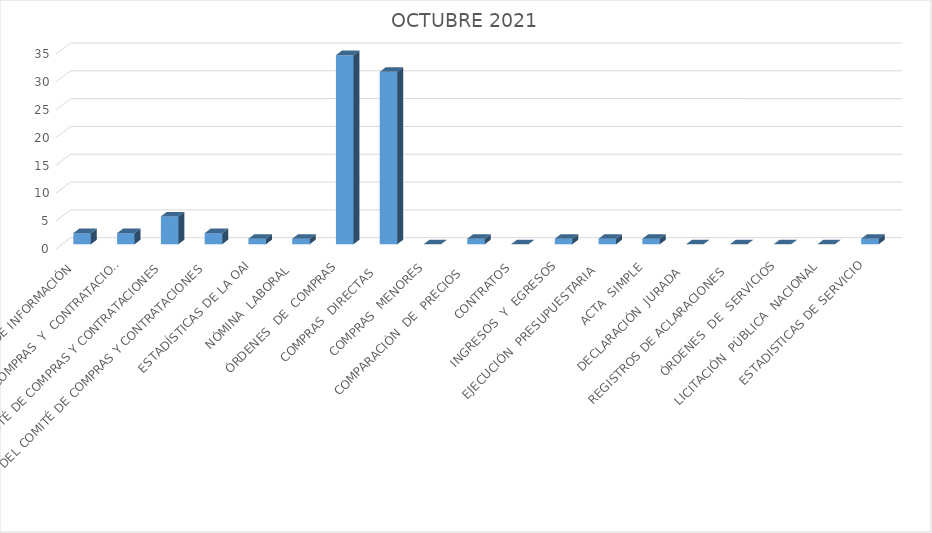
| Category | Series 0 |
|---|---|
| SOLICITUDES DE INFORMACIÓN  | 2 |
| REUNIONES DEL COMITÉ DE COMPRAS  Y  CONTRATACIONES | 2 |
| AGENDAS DEL COMITÉ DE COMPRAS Y CONTRATACIONES | 5 |
| ACTAS DEL COMITÉ DE COMPRAS Y CONTRATACIONES | 2 |
| ESTADÍSTICAS DE LA OAI | 1 |
| NÓMINA  LABORAL  | 1 |
| ÓRDENES  DE  COMPRAS | 34 |
| COMPRAS  DIRECTAS   | 31 |
| COMPRAS  MENORES | 0 |
| COMPARACIÓN  DE  PRECIOS   | 1 |
| CONTRATOS | 0 |
| INGRESOS  Y  EGRESOS | 1 |
| EJECUCIÓN  PRESUPUESTARIA   | 1 |
| ACTA  SIMPLE | 1 |
| DECLARACIÓN  JURADA   | 0 |
| REGISTROS DE ACLARACIONES   | 0 |
| ÓRDENES  DE  SERVICIOS | 0 |
| LICITACIÓN  PÚBLICA  NACIONAL | 0 |
| ESTADISTICAS DE SERVICIO | 1 |